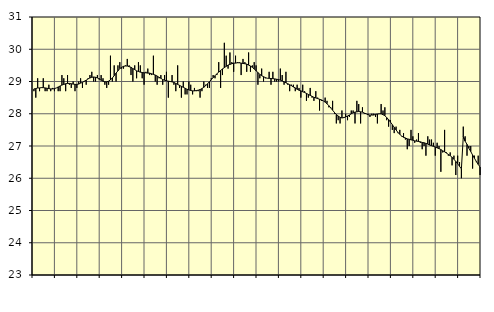
| Category | Piggar | Series 1 |
|---|---|---|
| nan | 28.7 | 28.77 |
| 1.0 | 28.5 | 28.78 |
| 1.0 | 29.1 | 28.8 |
| 1.0 | 28.7 | 28.8 |
| 1.0 | 28.8 | 28.81 |
| 1.0 | 29.1 | 28.81 |
| 1.0 | 28.7 | 28.8 |
| 1.0 | 28.7 | 28.79 |
| 1.0 | 28.9 | 28.78 |
| 1.0 | 28.7 | 28.77 |
| 1.0 | 28.8 | 28.77 |
| 1.0 | 28.7 | 28.78 |
| nan | 28.8 | 28.8 |
| 2.0 | 28.7 | 28.83 |
| 2.0 | 28.7 | 28.86 |
| 2.0 | 29.2 | 28.89 |
| 2.0 | 29.1 | 28.91 |
| 2.0 | 28.7 | 28.93 |
| 2.0 | 29.2 | 28.94 |
| 2.0 | 28.9 | 28.94 |
| 2.0 | 28.8 | 28.93 |
| 2.0 | 29 | 28.92 |
| 2.0 | 28.7 | 28.91 |
| 2.0 | 28.8 | 28.91 |
| nan | 29 | 28.92 |
| 3.0 | 29.1 | 28.95 |
| 3.0 | 28.8 | 28.97 |
| 3.0 | 29 | 29.01 |
| 3.0 | 28.9 | 29.04 |
| 3.0 | 29.1 | 29.08 |
| 3.0 | 29.2 | 29.11 |
| 3.0 | 29.3 | 29.13 |
| 3.0 | 29 | 29.14 |
| 3.0 | 29 | 29.13 |
| 3.0 | 29.2 | 29.11 |
| 3.0 | 29.1 | 29.07 |
| nan | 29.2 | 29.04 |
| 4.0 | 29.1 | 29.01 |
| 4.0 | 28.9 | 28.99 |
| 4.0 | 28.8 | 28.99 |
| 4.0 | 28.9 | 29.01 |
| 4.0 | 29.8 | 29.05 |
| 4.0 | 29 | 29.11 |
| 4.0 | 29.5 | 29.18 |
| 4.0 | 29 | 29.26 |
| 4.0 | 29.5 | 29.33 |
| 4.0 | 29.6 | 29.4 |
| 4.0 | 29.4 | 29.44 |
| nan | 29.4 | 29.47 |
| 5.0 | 29.5 | 29.48 |
| 5.0 | 29.7 | 29.48 |
| 5.0 | 29.5 | 29.46 |
| 5.0 | 29.2 | 29.44 |
| 5.0 | 29 | 29.4 |
| 5.0 | 29.5 | 29.37 |
| 5.0 | 29.1 | 29.33 |
| 5.0 | 29.6 | 29.31 |
| 5.0 | 29.5 | 29.29 |
| 5.0 | 29.1 | 29.28 |
| 5.0 | 28.9 | 29.27 |
| nan | 29.3 | 29.27 |
| 6.0 | 29.4 | 29.26 |
| 6.0 | 29.2 | 29.26 |
| 6.0 | 29.2 | 29.24 |
| 6.0 | 29.8 | 29.22 |
| 6.0 | 29 | 29.2 |
| 6.0 | 28.9 | 29.17 |
| 6.0 | 29.1 | 29.13 |
| 6.0 | 29.2 | 29.1 |
| 6.0 | 28.9 | 29.06 |
| 6.0 | 29.2 | 29.04 |
| 6.0 | 29.3 | 29.02 |
| nan | 28.5 | 29.01 |
| 7.0 | 29 | 29 |
| 7.0 | 29.2 | 28.99 |
| 7.0 | 28.9 | 28.97 |
| 7.0 | 28.7 | 28.94 |
| 7.0 | 29.5 | 28.91 |
| 7.0 | 28.8 | 28.88 |
| 7.0 | 28.5 | 28.85 |
| 7.0 | 29 | 28.82 |
| 7.0 | 28.6 | 28.79 |
| 7.0 | 28.6 | 28.76 |
| 7.0 | 29 | 28.74 |
| nan | 28.9 | 28.72 |
| 8.0 | 28.6 | 28.71 |
| 8.0 | 28.8 | 28.71 |
| 8.0 | 28.7 | 28.72 |
| 8.0 | 28.7 | 28.73 |
| 8.0 | 28.5 | 28.75 |
| 8.0 | 28.7 | 28.78 |
| 8.0 | 29 | 28.82 |
| 8.0 | 28.9 | 28.87 |
| 8.0 | 28.8 | 28.93 |
| 8.0 | 28.8 | 28.99 |
| 8.0 | 29.1 | 29.06 |
| nan | 29.2 | 29.12 |
| 9.0 | 29.1 | 29.18 |
| 9.0 | 29.2 | 29.24 |
| 9.0 | 29.6 | 29.29 |
| 9.0 | 28.8 | 29.34 |
| 9.0 | 29.2 | 29.39 |
| 9.0 | 30.2 | 29.43 |
| 9.0 | 29.8 | 29.47 |
| 9.0 | 29.4 | 29.51 |
| 9.0 | 29.9 | 29.53 |
| 9.0 | 29.6 | 29.55 |
| 9.0 | 29.3 | 29.57 |
| nan | 29.8 | 29.57 |
| 10.0 | 29.6 | 29.58 |
| 10.0 | 29.6 | 29.58 |
| 10.0 | 29.2 | 29.57 |
| 10.0 | 29.7 | 29.56 |
| 10.0 | 29.6 | 29.55 |
| 10.0 | 29.3 | 29.54 |
| 10.0 | 29.9 | 29.51 |
| 10.0 | 29.3 | 29.48 |
| 10.0 | 29.5 | 29.44 |
| 10.0 | 29.6 | 29.39 |
| 10.0 | 29.5 | 29.33 |
| nan | 28.9 | 29.28 |
| 11.0 | 29.1 | 29.22 |
| 11.0 | 29.4 | 29.18 |
| 11.0 | 29 | 29.15 |
| 11.0 | 29.1 | 29.12 |
| 11.0 | 29.1 | 29.1 |
| 11.0 | 29.3 | 29.1 |
| 11.0 | 28.9 | 29.09 |
| 11.0 | 29.3 | 29.09 |
| 11.0 | 29 | 29.08 |
| 11.0 | 29 | 29.07 |
| 11.0 | 29 | 29.06 |
| nan | 29.4 | 29.04 |
| 12.0 | 29.2 | 29.02 |
| 12.0 | 28.9 | 28.99 |
| 12.0 | 29.3 | 28.96 |
| 12.0 | 28.9 | 28.93 |
| 12.0 | 28.7 | 28.9 |
| 12.0 | 28.9 | 28.87 |
| 12.0 | 28.9 | 28.83 |
| 12.0 | 28.7 | 28.8 |
| 12.0 | 28.9 | 28.76 |
| 12.0 | 28.8 | 28.73 |
| 12.0 | 28.5 | 28.71 |
| nan | 28.9 | 28.68 |
| 13.0 | 28.7 | 28.66 |
| 13.0 | 28.4 | 28.63 |
| 13.0 | 28.5 | 28.6 |
| 13.0 | 28.8 | 28.57 |
| 13.0 | 28.5 | 28.54 |
| 13.0 | 28.4 | 28.51 |
| 13.0 | 28.7 | 28.49 |
| 13.0 | 28.5 | 28.47 |
| 13.0 | 28.1 | 28.45 |
| 13.0 | 28.4 | 28.43 |
| 13.0 | 28.4 | 28.4 |
| nan | 28.5 | 28.36 |
| 14.0 | 28.4 | 28.31 |
| 14.0 | 28.2 | 28.25 |
| 14.0 | 28.2 | 28.18 |
| 14.0 | 28.4 | 28.11 |
| 14.0 | 28 | 28.04 |
| 14.0 | 27.7 | 27.98 |
| 14.0 | 27.8 | 27.93 |
| 14.0 | 27.7 | 27.89 |
| 14.0 | 28.1 | 27.87 |
| 14.0 | 27.9 | 27.88 |
| 14.0 | 28 | 27.9 |
| nan | 27.8 | 27.93 |
| 15.0 | 27.9 | 27.96 |
| 15.0 | 28.1 | 28 |
| 15.0 | 28.1 | 28.03 |
| 15.0 | 27.7 | 28.05 |
| 15.0 | 28.4 | 28.06 |
| 15.0 | 28.3 | 28.07 |
| 15.0 | 27.7 | 28.06 |
| 15.0 | 28.2 | 28.05 |
| 15.0 | 28 | 28.02 |
| 15.0 | 28 | 28 |
| 15.0 | 28 | 27.97 |
| nan | 27.9 | 27.96 |
| 16.0 | 28 | 27.96 |
| 16.0 | 28 | 27.96 |
| 16.0 | 27.9 | 27.98 |
| 16.0 | 27.7 | 27.99 |
| 16.0 | 28 | 28 |
| 16.0 | 28.3 | 28 |
| 16.0 | 28.1 | 27.97 |
| 16.0 | 28.2 | 27.94 |
| 16.0 | 27.8 | 27.88 |
| 16.0 | 27.6 | 27.82 |
| 16.0 | 27.8 | 27.74 |
| nan | 27.5 | 27.66 |
| 17.0 | 27.4 | 27.58 |
| 17.0 | 27.6 | 27.5 |
| 17.0 | 27.4 | 27.42 |
| 17.0 | 27.5 | 27.36 |
| 17.0 | 27.3 | 27.31 |
| 17.0 | 27.4 | 27.27 |
| 17.0 | 27.2 | 27.25 |
| 17.0 | 26.9 | 27.22 |
| 17.0 | 27 | 27.21 |
| 17.0 | 27.5 | 27.19 |
| 17.0 | 27.3 | 27.18 |
| nan | 27.1 | 27.16 |
| 18.0 | 27.2 | 27.15 |
| 18.0 | 27.4 | 27.14 |
| 18.0 | 27.1 | 27.13 |
| 18.0 | 26.9 | 27.11 |
| 18.0 | 27 | 27.1 |
| 18.0 | 26.7 | 27.08 |
| 18.0 | 27.3 | 27.06 |
| 18.0 | 27.2 | 27.03 |
| 18.0 | 27.2 | 27.01 |
| 18.0 | 27.1 | 26.99 |
| 18.0 | 26.7 | 26.97 |
| nan | 27.1 | 26.94 |
| 19.0 | 27 | 26.92 |
| 19.0 | 26.2 | 26.89 |
| 19.0 | 26.8 | 26.85 |
| 19.0 | 27.5 | 26.82 |
| 19.0 | 26.8 | 26.78 |
| 19.0 | 26.7 | 26.74 |
| 19.0 | 26.8 | 26.7 |
| 19.0 | 26.4 | 26.65 |
| 19.0 | 26.7 | 26.59 |
| 19.0 | 26.1 | 26.52 |
| 19.0 | 26.7 | 26.45 |
| nan | 26.5 | 26.37 |
| 20.0 | 26 | 26.29 |
| 20.0 | 27.6 | 27.29 |
| 20.0 | 27.3 | 27.15 |
| 20.0 | 26.7 | 27.05 |
| 20.0 | 27 | 26.93 |
| 20.0 | 27 | 26.83 |
| 20.0 | 26.3 | 26.72 |
| 20.0 | 26.7 | 26.62 |
| 20.0 | 26.5 | 26.52 |
| 20.0 | 26.7 | 26.43 |
| 20.0 | 26.1 | 26.35 |